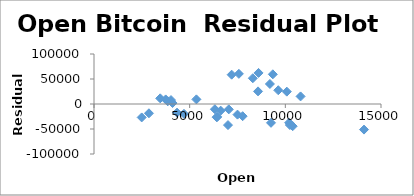
| Category | Series 0 |
|---|---|
| 2492.600098 | -26855.454 |
| 2871.300049 | -18582.515 |
| 4701.759766 | -19671.331 |
| 4341.049805 | -17314.285 |
| 6440.970215 | -25797.517 |
| 10198.599609 | -37488.378 |
| 14112.200195 | -51187.306 |
| 10237.299805 | -42078.439 |
| 10385.0 | -44383.911 |
| 7003.060059 | -42163.753 |
| 9251.469727 | -37643.687 |
| 7500.700195 | -21227.245 |
| 6411.680176 | -26431.716 |
| 7769.040039 | -24349.829 |
| 7044.810059 | -10742.543 |
| 6619.850098 | -13288.416 |
| 6318.140137 | -10467.833 |
| 4024.464355 | 7881.266 |
| 3746.713379 | 9128.312 |
| 3460.547119 | 11326.315 |
| 3853.75708 | 5420.248 |
| 4105.362305 | 1985.203 |
| 5350.914551 | 9250.39 |
| 8573.839844 | 25231.416 |
| 10796.930664 | 15185.083 |
| 10077.442383 | 24715.773 |
| 9630.592773 | 27528.885 |
| 8299.720703 | 51530.378 |
| 9193.992188 | 40044.916 |
| 7571.616211 | 60302.988 |
| 7194.89209 | 58646.867 |
| 9346.357422 | 59353.387 |
| 8599.758789 | 62142.726 |